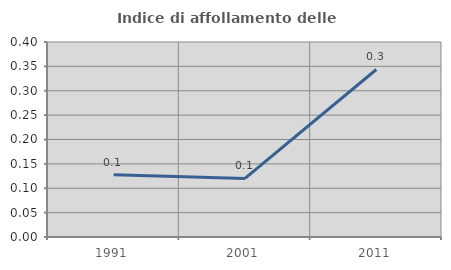
| Category | Indice di affollamento delle abitazioni  |
|---|---|
| 1991.0 | 0.128 |
| 2001.0 | 0.12 |
| 2011.0 | 0.344 |